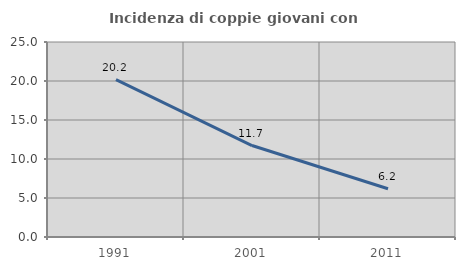
| Category | Incidenza di coppie giovani con figli |
|---|---|
| 1991.0 | 20.169 |
| 2001.0 | 11.724 |
| 2011.0 | 6.179 |